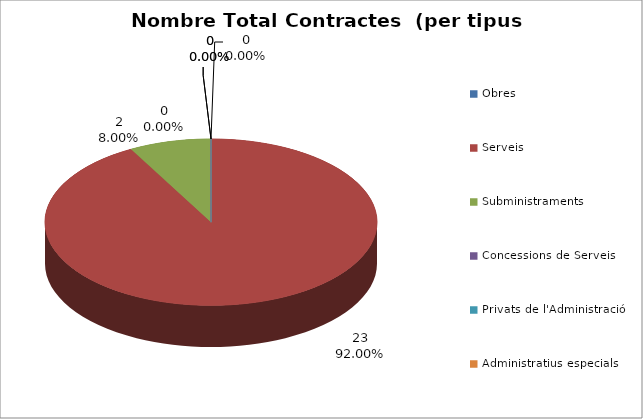
| Category | Nombre Total Contractes |
|---|---|
| Obres | 0 |
| Serveis | 23 |
| Subministraments | 2 |
| Concessions de Serveis | 0 |
| Privats de l'Administració | 0 |
| Administratius especials | 0 |